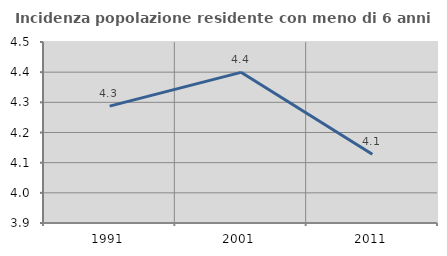
| Category | Incidenza popolazione residente con meno di 6 anni |
|---|---|
| 1991.0 | 4.287 |
| 2001.0 | 4.399 |
| 2011.0 | 4.128 |